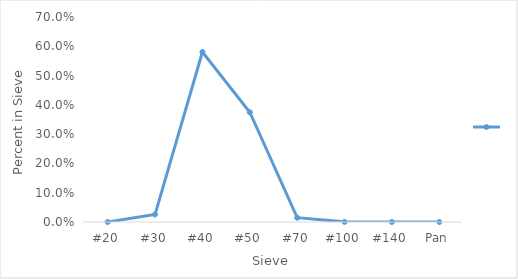
| Category | Series 0 |
|---|---|
| #20 | 0 |
| #30 | 0.026 |
| #40 | 0.581 |
| #50 | 0.375 |
| #70 | 0.015 |
| #100 | 0 |
| #140 | 0 |
| Pan | 0 |